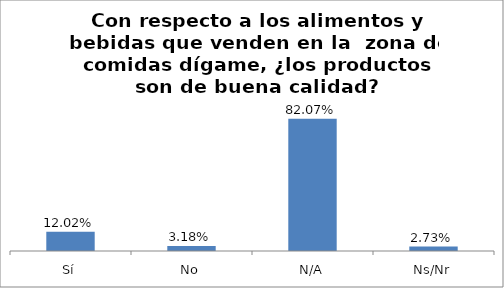
| Category | Total |
|---|---|
| Sí | 0.12 |
| No | 0.032 |
| N/A | 0.821 |
| Ns/Nr | 0.027 |